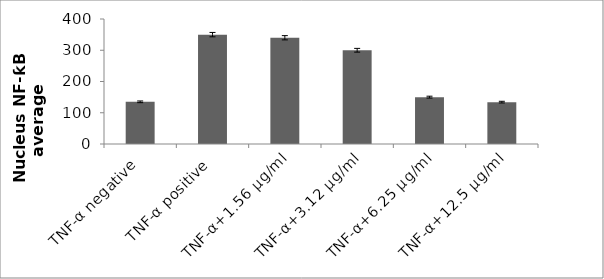
| Category | Series 0 |
|---|---|
| TNF-α negative | 135 |
| TNF-α positive | 350 |
| TNF-α+1.56 µg/ml | 340 |
| TNF-α+3.12 µg/ml | 300 |
| TNF-α+6.25 µg/ml | 150 |
| TNF-α+12.5 µg/ml | 134 |